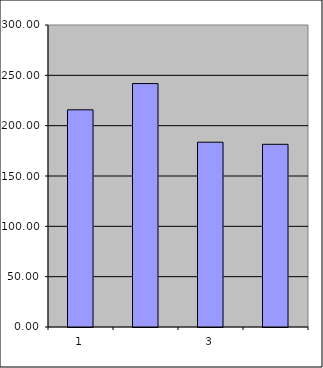
| Category | Series 0 |
|---|---|
| 0 | 215.75 |
| 1 | 241.804 |
| 2 | 183.587 |
| 3 | 181.478 |